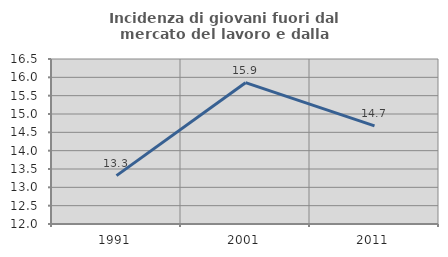
| Category | Incidenza di giovani fuori dal mercato del lavoro e dalla formazione  |
|---|---|
| 1991.0 | 13.319 |
| 2001.0 | 15.854 |
| 2011.0 | 14.676 |